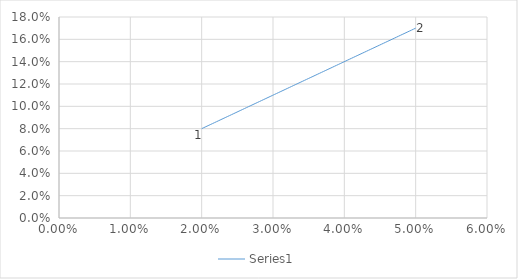
| Category | Series 0 |
|---|---|
| 0.05 | 0.17 |
| 0.0497 | 0.169 |
| 0.049400000000000006 | 0.168 |
| 0.049100000000000005 | 0.167 |
| 0.0488 | 0.166 |
| 0.0485 | 0.166 |
| 0.0482 | 0.165 |
| 0.047900000000000005 | 0.164 |
| 0.0476 | 0.163 |
| 0.0473 | 0.162 |
| 0.04700000000000001 | 0.161 |
| 0.0467 | 0.16 |
| 0.046400000000000004 | 0.159 |
| 0.0461 | 0.158 |
| 0.0458 | 0.157 |
| 0.0455 | 0.157 |
| 0.0452 | 0.156 |
| 0.0449 | 0.155 |
| 0.0446 | 0.154 |
| 0.0443 | 0.153 |
| 0.044 | 0.152 |
| 0.0437 | 0.151 |
| 0.0434 | 0.15 |
| 0.0431 | 0.149 |
| 0.0428 | 0.148 |
| 0.0425 | 0.148 |
| 0.04220000000000001 | 0.147 |
| 0.04190000000000001 | 0.146 |
| 0.0416 | 0.145 |
| 0.0413 | 0.144 |
| 0.041 | 0.143 |
| 0.0407 | 0.142 |
| 0.0404 | 0.141 |
| 0.0401 | 0.14 |
| 0.0398 | 0.139 |
| 0.0395 | 0.138 |
| 0.0392 | 0.138 |
| 0.038900000000000004 | 0.137 |
| 0.0386 | 0.136 |
| 0.0383 | 0.135 |
| 0.038 | 0.134 |
| 0.0377 | 0.133 |
| 0.037399999999999996 | 0.132 |
| 0.037099999999999994 | 0.131 |
| 0.0368 | 0.13 |
| 0.0365 | 0.13 |
| 0.036199999999999996 | 0.129 |
| 0.0359 | 0.128 |
| 0.03559999999999999 | 0.127 |
| 0.03529999999999999 | 0.126 |
| 0.034999999999999996 | 0.125 |
| 0.034699999999999995 | 0.124 |
| 0.03439999999999999 | 0.123 |
| 0.03409999999999999 | 0.122 |
| 0.03379999999999999 | 0.121 |
| 0.033499999999999995 | 0.12 |
| 0.03319999999999999 | 0.12 |
| 0.03289999999999999 | 0.119 |
| 0.03259999999999999 | 0.118 |
| 0.03229999999999999 | 0.117 |
| 0.031999999999999994 | 0.116 |
| 0.03169999999999999 | 0.115 |
| 0.03139999999999999 | 0.114 |
| 0.031099999999999992 | 0.113 |
| 0.03079999999999999 | 0.112 |
| 0.030499999999999992 | 0.111 |
| 0.03019999999999999 | 0.111 |
| 0.02989999999999999 | 0.11 |
| 0.02959999999999999 | 0.109 |
| 0.02929999999999999 | 0.108 |
| 0.02899999999999999 | 0.107 |
| 0.02869999999999999 | 0.106 |
| 0.028399999999999988 | 0.105 |
| 0.028099999999999986 | 0.104 |
| 0.027799999999999988 | 0.103 |
| 0.027499999999999986 | 0.102 |
| 0.027199999999999988 | 0.102 |
| 0.026899999999999986 | 0.101 |
| 0.026599999999999985 | 0.1 |
| 0.026299999999999987 | 0.099 |
| 0.025999999999999985 | 0.098 |
| 0.025699999999999987 | 0.097 |
| 0.025399999999999985 | 0.096 |
| 0.025099999999999983 | 0.095 |
| 0.024799999999999985 | 0.094 |
| 0.024499999999999984 | 0.093 |
| 0.024199999999999985 | 0.093 |
| 0.023899999999999984 | 0.092 |
| 0.023599999999999986 | 0.091 |
| 0.023299999999999984 | 0.09 |
| 0.022999999999999982 | 0.089 |
| 0.02269999999999998 | 0.088 |
| 0.022399999999999982 | 0.087 |
| 0.022099999999999984 | 0.086 |
| 0.021799999999999983 | 0.085 |
| 0.02149999999999998 | 0.084 |
| 0.02119999999999998 | 0.084 |
| 0.02089999999999998 | 0.083 |
| 0.020599999999999983 | 0.082 |
| 0.02029999999999998 | 0.081 |
| 0.020000000000000014 | 0.08 |